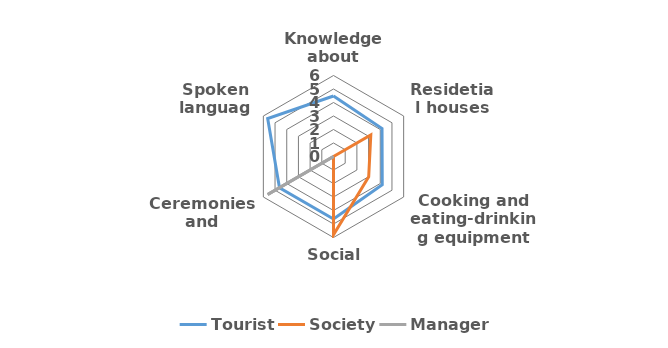
| Category | Tourist | Society | Manager |
|---|---|---|---|
| Knowledge about nature | 4.48 | 0 | 0 |
| Residetial houses | 4.15 | 3.19 | 0 |
| Cooking and eating-drinking equipment | 4.17 | 3.01 | 0 |
| Social system | 4.63 | 5.8 | 0 |
| Ceremonies and holidays | 4.62 | 0 | 5.63 |
| Spoken language | 5.63 | 0 | 0 |